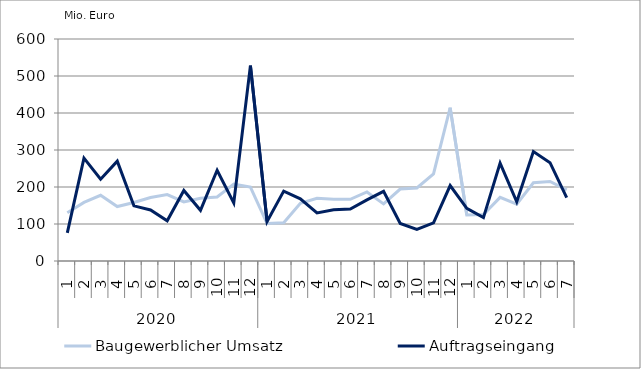
| Category | Baugewerblicher Umsatz | Auftragseingang |
|---|---|---|
| 0 | 130445.562 | 75891.481 |
| 1 | 158433.655 | 277923.85 |
| 2 | 177529.832 | 220973.626 |
| 3 | 147259.799 | 269936.091 |
| 4 | 157965.891 | 149072.895 |
| 5 | 171647.778 | 137984.76 |
| 6 | 179530.732 | 108645.965 |
| 7 | 159480.457 | 190771.468 |
| 8 | 169638.111 | 136988.906 |
| 9 | 173040.053 | 245341.603 |
| 10 | 207619.085 | 156647.224 |
| 11 | 199947.086 | 528166.004 |
| 12 | 101295.895 | 106850.127 |
| 13 | 103236.543 | 188883.434 |
| 14 | 156172.725 | 168204.42 |
| 15 | 169257.088 | 130052.073 |
| 16 | 166897.821 | 138492.214 |
| 17 | 166720.216 | 140262.426 |
| 18 | 186515.191 | 165331.191 |
| 19 | 154188.941 | 188169.655 |
| 20 | 194464.12 | 101359.538 |
| 21 | 197281.201 | 85626.862 |
| 22 | 235325.083 | 102880.924 |
| 23 | 414469.471 | 203900.676 |
| 24 | 124217.549 | 142351.759 |
| 25 | 125619.696 | 117194.423 |
| 26 | 171896.664 | 264509.013 |
| 27 | 153384.654 | 160146.519 |
| 28 | 211335.38 | 295997.826 |
| 29 | 214914.164 | 265813.917 |
| 30 | 192047.613 | 171529.517 |